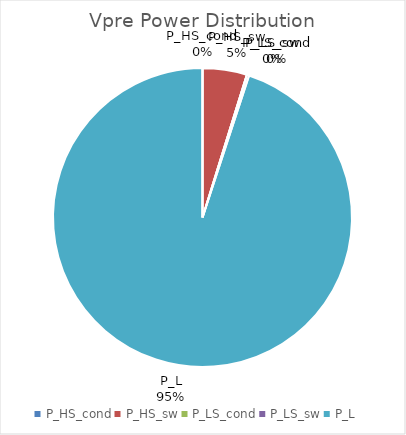
| Category | Vpre Power Distribution |
|---|---|
| P_HS_cond | 0 |
| P_HS_sw | 0 |
| P_LS_cond | 0 |
| P_LS_sw | 0 |
| P_L | 0.004 |